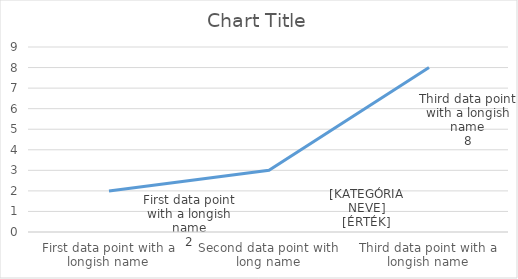
| Category | Series 0 |
|---|---|
| First data point with a longish name | 2 |
| Second data point with long name | 3 |
| Third data point with a longish name | 8 |